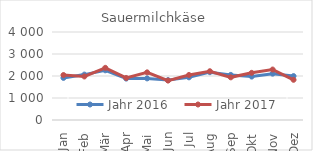
| Category | Jahr 2016 | Jahr 2017 |
|---|---|---|
| Jan | 1913.185 | 2043.767 |
| Feb | 2063.596 | 1979.371 |
| Mär | 2259.528 | 2371.371 |
| Apr | 1882.8 | 1910.748 |
| Mai | 1891.009 | 2165.19 |
| Jun | 1813.084 | 1791.901 |
| Jul | 1939.859 | 2046.603 |
| Aug | 2174.217 | 2216.608 |
| Sep | 2050.061 | 1939.26 |
| Okt | 1973.964 | 2143.657 |
| Nov | 2106.562 | 2294.027 |
| Dez | 1996.285 | 1827.599 |